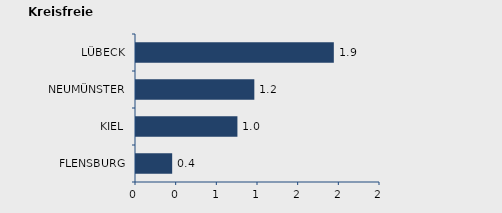
| Category | Wanderungssaldo |
|---|---|
| FLENSBURG | 0.356 |
| KIEL | 0.998 |
| NEUMÜNSTER | 1.164 |
| LÜBECK | 1.946 |